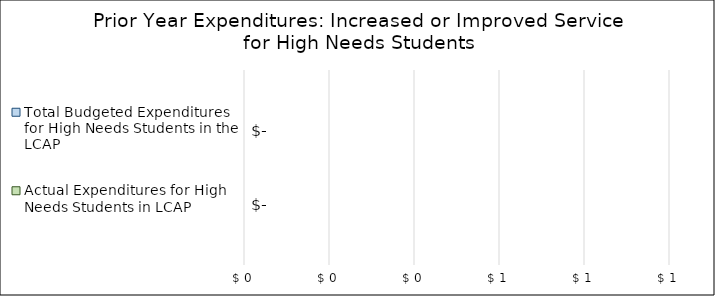
| Category | Actual Expenditures for High Needs Students in LCAP | Total Budgeted Expenditures for High Needs Students in the LCAP |
|---|---|---|
| 0 | 0 | 0 |